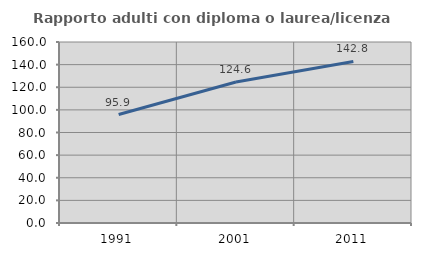
| Category | Rapporto adulti con diploma o laurea/licenza media  |
|---|---|
| 1991.0 | 95.862 |
| 2001.0 | 124.607 |
| 2011.0 | 142.793 |